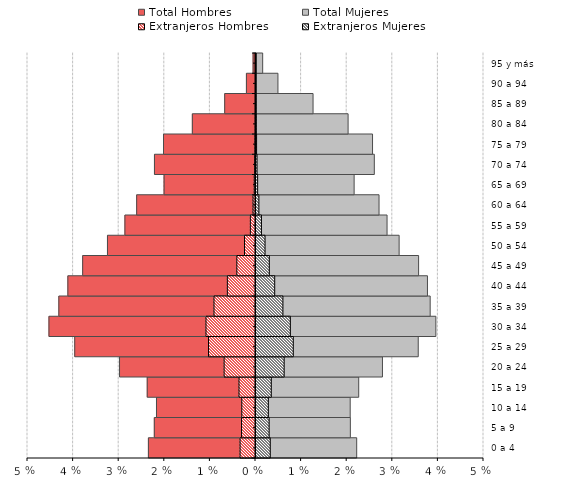
| Category | Total Hombres | Total Mujeres | Extranjeros Hombres | Extranjeros Mujeres |
|---|---|---|---|---|
| 0 a 4 | -0.023 | 0.022 | -0.003 | 0.003 |
| 5 a 9 | -0.022 | 0.021 | -0.003 | 0.003 |
| 10 a 14 | -0.022 | 0.021 | -0.003 | 0.003 |
| 15 a 19 | -0.024 | 0.023 | -0.004 | 0.003 |
| 20 a 24 | -0.03 | 0.028 | -0.007 | 0.006 |
| 25 a 29 | -0.04 | 0.036 | -0.01 | 0.008 |
| 30 a 34 | -0.045 | 0.039 | -0.011 | 0.008 |
| 35 a 39 | -0.043 | 0.038 | -0.009 | 0.006 |
| 40 a 44 | -0.041 | 0.038 | -0.006 | 0.004 |
| 45 a 49 | -0.038 | 0.036 | -0.004 | 0.003 |
| 50 a 54 | -0.032 | 0.031 | -0.002 | 0.002 |
| 55 a 59 | -0.029 | 0.029 | -0.001 | 0.001 |
| 60 a 64 | -0.026 | 0.027 | -0.001 | 0.001 |
| 65 a 69 | -0.02 | 0.022 | 0 | 0 |
| 70 a 74 | -0.022 | 0.026 | 0 | 0 |
| 75 a 79 | -0.02 | 0.026 | 0 | 0 |
| 80 a 84 | -0.014 | 0.02 | 0 | 0 |
| 85 a 89 | -0.007 | 0.013 | 0 | 0 |
| 90 a 94 | -0.002 | 0.005 | 0 | 0 |
| 95 y más | -0.001 | 0.001 | 0 | 0 |